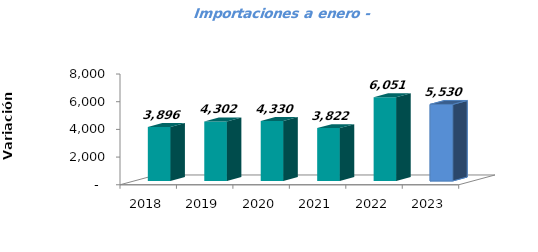
| Category | Series 0 |
|---|---|
| 2018-01-01 | 3895.929 |
| 2019-01-01 | 4302.195 |
| 2020-01-01 | 4329.618 |
| 2021-01-01 | 3822.025 |
| 2022-01-01 | 6050.578 |
| 2023-01-01 | 5529.665 |